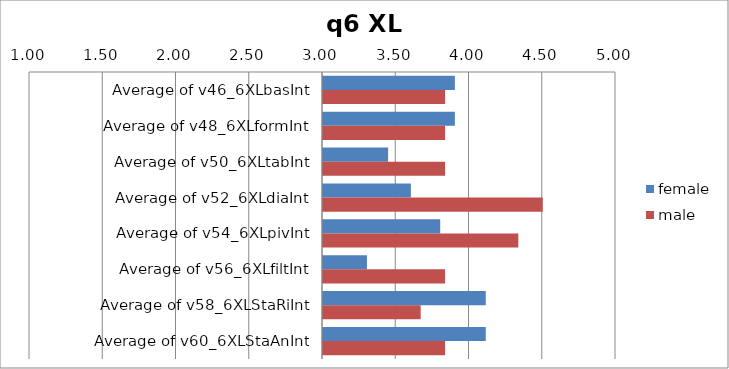
| Category | female | male |
|---|---|---|
| Average of v46_6XLbasInt | 3.9 | 3.833 |
| Average of v48_6XLformInt | 3.9 | 3.833 |
| Average of v50_6XLtabInt | 3.444 | 3.833 |
| Average of v52_6XLdiaInt | 3.6 | 4.5 |
| Average of v54_6XLpivInt | 3.8 | 4.333 |
| Average of v56_6XLfiltInt | 3.3 | 3.833 |
| Average of v58_6XLStaRiInt | 4.111 | 3.667 |
| Average of v60_6XLStaAnInt | 4.111 | 3.833 |